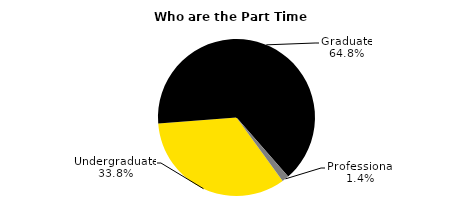
| Category | Series 0 |
|---|---|
| Undergraduate | 1508 |
| Graduate | 2889 |
| Professional | 64 |